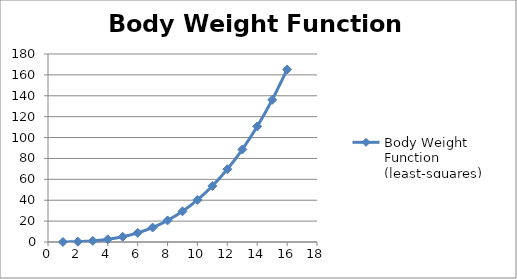
| Category | Body Weight Function (least-squares) |
|---|---|
| 1.0 | 0.04 |
| 2.0 | 0.323 |
| 3.0 | 1.089 |
| 4.0 | 2.581 |
| 5.0 | 5.04 |
| 6.0 | 8.71 |
| 7.0 | 13.831 |
| 8.0 | 20.645 |
| 9.0 | 29.395 |
| 10.0 | 40.323 |
| 11.0 | 53.67 |
| 12.0 | 69.678 |
| 13.0 | 88.59 |
| 14.0 | 110.646 |
| 15.0 | 136.09 |
| 16.0 | 165.163 |